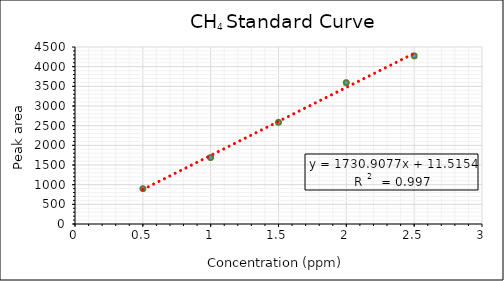
| Category | Series 0 |
|---|---|
| 0.5 | 898.282 |
| 1.0 | 1688.282 |
| 1.5 | 2586.564 |
| 2.0 | 3593.128 |
| 2.5 | 4273.128 |